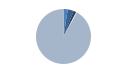
| Category | Series 0 |
|---|---|
| ARRASTRE | 23 |
| CERCO | 33 |
| PALANGRE | 15 |
| REDES DE ENMALLE | 5 |
| ARTES MENORES | 853 |
| SIN TIPO ASIGNADO | 0 |